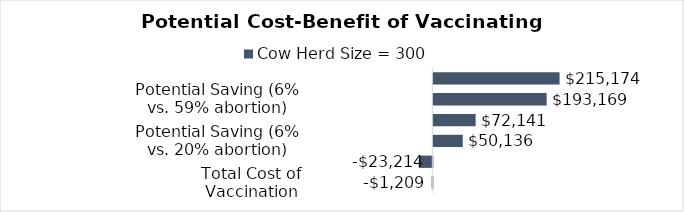
| Category | Cow Herd Size = 300 |
|---|---|
| Total Cost of Vaccination | -1209 |
| Possible Loss (6% abortion) | -23214 |
| Potential Saving (6% vs. 20% abortion) | 50136 |
| Potential Saving (0% vs. 20% abortion) | 72141 |
| Potential Saving (6% vs. 59% abortion) | 193168.5 |
| Potential Saving (0% vs. 59% abortion) | 215173.5 |